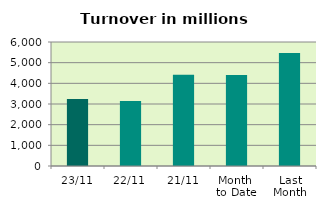
| Category | Series 0 |
|---|---|
| 23/11 | 3236.294 |
| 22/11 | 3141.906 |
| 21/11 | 4410.037 |
| Month 
to Date | 4407.527 |
| Last
Month | 5472.473 |